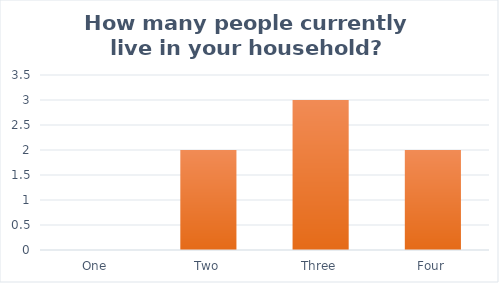
| Category | Series 0 |
|---|---|
| One | 0 |
| Two | 2 |
| Three | 3 |
| Four | 2 |